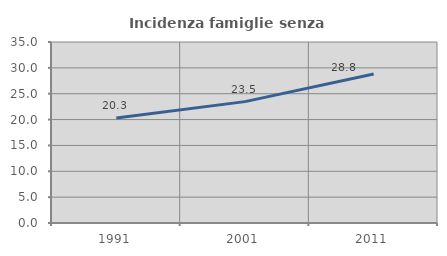
| Category | Incidenza famiglie senza nuclei |
|---|---|
| 1991.0 | 20.323 |
| 2001.0 | 23.469 |
| 2011.0 | 28.798 |